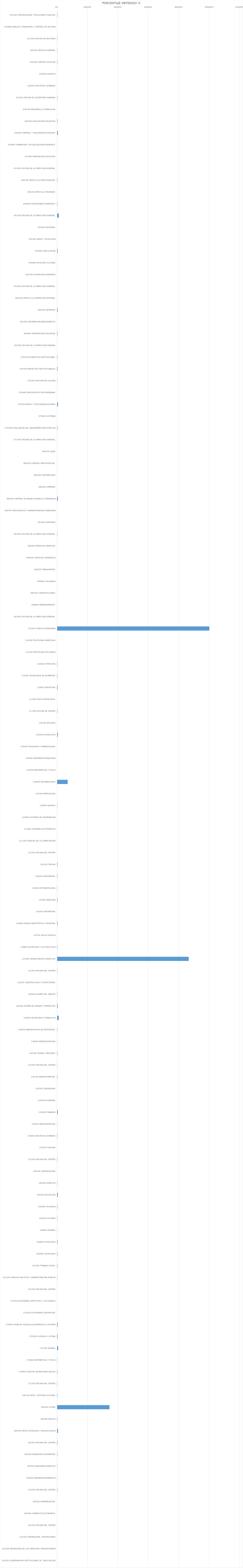
| Category | PORCENTAJE OBTENIDO % |
|---|---|
| 010100 COMUNICACION Y RELACIONES PUBLICAS | 0.96 |
| 010600 ANALISIS FINANCIERO Y CONTROL DE GESTION | 0 |
| 011500 OFICINA DE RECTORIA | 0.67 |
| 020100 ARCHIVO GENERAL | 0.63 |
| 020200 CONTROL ESCOLAR | 1.02 |
| 020300 JURIDICO | 0 |
| 020400 RECURSOS HUMANOS | 0 |
| 021500 OFICINA DE SECRETARIA GENERAL | 1 |
| 030200 DESARROLLO CURRICULAR | 0 |
| 030300 EVALUACION EDUCATIVA | 1.44 |
| 030400 CONTROL Y SEGUIMIENTO DOCENTE | 4.28 |
| 030900 FORMACION Y ACTUALIZACION ACADEMICA | 0 |
| 031000 INNOVACION EDUCATIVA | 0 |
| 031500 OFICINA DE LA DIRECCION GENERAL  | 0 |
| 040100 APOYO A LA INVESTIGACION  | 1 |
| 040200 APOYO AL POSGRADO | 0 |
| 040400 INTERCAMBIO ACADEMICO | 1 |
| 041500 OFICINA DE LA DIRECCION GENERAL  | 10.14 |
| 050200 EDITORIAL | 0 |
| 050300 RADIO Y TELEVISION | 0 |
| 050400 VINCULACION | 2.7 |
| 050600 DIFUSION CULTURAL | 0 |
| 050700 EXTENSION ACADEMICA | 0 |
| 051500 OFICINA DE LA DIRECCION GENERAL  | 0 |
| 060100 APOYO A LA FORMACION INTEGRAL | 0 |
| 060200 DEPORTES | 2.75 |
| 060300 INFORMACION BIBLIOGRAFICA | 0 |
| 060400 ORIENTACION EDUCATIVA | 1.5 |
| 061500 OFICINA DE LA DIRECCION GENERAL | 0 |
| 070100 ESTADISTICA INSTITUCIONAL  | 1.17 |
| 070200 PROYECTOS INSTITUCIONALES | 2.17 |
| 070300 GESTION DE CALIDAD | 0.45 |
| 070400 PRESUPUESTO POR PROGRAMA | 0 |
| 070500 REDES Y TELECOMUNICACIONES | 4.96 |
| 070600 SISTEMAS | 0 |
| 070700 EVALUACION DEL DESEMPEÑO PRESUPUESTAL | 1.4 |
| 071500 OFICINA DE LA DIRECCION GENERAL  | 0 |
| 080100 CAJAS | 0 |
| 080200 CONTROL PRESUPUESTAL  | 0 |
| 080300 CONTABILIDAD | 0 |
| 080400 COMPRAS | 0 |
| 080500 CONTROL DE BIENES MUEBLES E INMUEBLES | 4.44 |
| 080700 PRESUPUESTO Y ADMINISTRACION FINANCIERA | 0 |
| 081400 JUBILADOS | 0 |
| 081500 OFICINA DE LA DIRECCION GENERAL  | 0.5 |
| 090300 PROCESOS GRAFICOS | 0 |
| 090400 SERVICIOS GENERALES | 0 |
| 090500 TRANSPORTES | 0 |
| 090600 VIGILANCIA | 0 |
| 090700 CONSTRUCCIONES | 0 |
| 090800 MANTENIMIENTO  | 0 |
| 091500 OFICINA DE LA DIRECCION GENERAL  | 0 |
| 110100 CLINICA VETERINARIA | 1000 |
| 110200 DISCIPLINAS AGRICOLAS | 0 |
| 110300 DISCIPLINAS PECUARIAS | 0 |
| 110400 FITOTECNIA | 1 |
| 110500 TECNOLOGIA DE ALIMENTOS | 1 |
| 110600 ZOOTECNIA | 2.5 |
| 111400 POSTA ZOOTECNICA | 0 |
| 111500 OFICINA DE CENTRO | 1.01 |
| 120100 BIOLOGIA | 0 |
| 120200 ESTADISTICA | 4 |
| 120300 FISIOLOGIA Y FARMACOLOGIA | 0 |
| 120400 INGENIERIA BIOQUIMICA | 0 |
| 120500 MATEMATICAS Y FISICA | 0 |
| 120600 MICROBIOLOGIA | 68.67 |
| 120700 MORFOLOGIA | 0 |
| 120800 QUIMICA | 0.5 |
| 120900 SISTEMAS DE INFORMACION | 0 |
| 121000 SISTEMAS ELECTRONICOS | 0 |
| 121100 CIENCIAS DE LA COMPUTACION | 0 |
| 121500 OFICINA DEL CENTRO | 0 |
| 130100 CIRUGIA | 1.63 |
| 130200 ENFERMERIA  | 1 |
| 130300 ESTOMATOLOGIA | 0.5 |
| 130400 MEDICINA | 1.8 |
| 130500 OPTOMETRIA | 0 |
| 130600 GINECO-OBSTETRICIA Y PEDIATRIA | 2 |
| 130700 SALUD PUBLICA | 0 |
| 130800 NUTRICION Y CULTURA FISICA | 1 |
| 131400 UNIDAD MEDICO DIDACTICA | 864 |
| 131500 OFICINA DEL CENTRO | 0.64 |
| 140100 CONSTRUCCION Y ESTRUCTURAS | 0 |
| 140200 DISEÑO DEL HABITAT | 0.67 |
| 140300 DISEÑO DE IMAGEN Y PRODUCTOS | 3.06 |
| 140400 GEOTECNIA E HIDRAULICA | 10 |
| 140500 MANUFACTURA DE PROTOTIPOS | 0.83 |
| 140600 REPRESENTACION | 0.16 |
| 140700 TEORIA Y METODOS | 1.22 |
| 141500 OFICINA DEL CENTRO | 0.43 |
| 150100 ADMINISTRACION  | 1 |
| 150200 CONTADURIA | 0 |
| 150300 ECONOMIA | 0 |
| 150400 FINANZAS | 4 |
| 150500 MERCADOTECNIA | 0.17 |
| 150600 RECURSOS HUMANOS | 1 |
| 150700 TURISMO | 0 |
| 151500 OFICINA DEL CENTRO | 0.79 |
| 160100 COMUNICACION | 0 |
| 160200 DERECHO | 0.61 |
| 160300 EDUCACION | 3.97 |
| 160400 FILOSOFIA | 1.22 |
| 160500 HISTORIA | 0.75 |
| 160600 IDIOMAS | 0.11 |
| 160800 PSICOLOGIA | 1.92 |
| 160900 SOCIOLOGIA | 1.4 |
| 161000 TRABAJO SOCIAL | 1.2 |
| 161100 CIENCIAS POLITICAS Y ADMINISTRACION PUBLICA | 0.5 |
| 161500 OFICINA DEL CENTRO | 0 |
| 170100 ACTIVIDADES ARTISTICAS Y CULTURALES | 0 |
| 170200 ACTIVIDADES DEPORTIVAS | 0 |
| 170400 CIENCIAS SOCIALES,ECONOMICAS E HISTORIA | 3 |
| 170500 FILOSOFIA Y LETRAS | 2.5 |
| 170700 IDIOMAS | 5.99 |
| 170800 MATEMATICAS Y FISICA | 0.5 |
| 170900 CIENCIAS QUIMICO-BIOLOGICAS | 1.33 |
| 171500 OFICINA DEL CENTRO | 0.65 |
| 180100 ARTE Y GESTION CULTURAL | 1.25 |
| 180200 LETRAS | 343.29 |
| 180300 MUSICA | 1.07 |
| 180500 ARTES ESCENICAS Y AUDIOVISUALES | 5.05 |
| 181500 OFICINA DEL CENTRO | 1.67 |
| 190200 INGENIERIA AUTOMOTRIZ | 0.9 |
| 190300 INGENIERIA ROBOTICA | 0.5 |
| 190400 INGENIERIA BIOMEDICA | 0.18 |
| 191500 OFICINA DEL CENTRO | 1 |
| 200200 AGRONEGOCIOS | 0 |
| 200300 COMERCIO ELECTRONICO | 0 |
| 201500 OFICINA DEL CENTRO | 0 |
| 210100 CONTRALORIA  UNIVERSITARIA | 0 |
| 220100 DEFENSORIA DE LOS DERECHOS UNIVERSITARIOS | 0 |
| 230100 COORDINACION INSTITUCIONAL DE  VINCULACION | 0 |